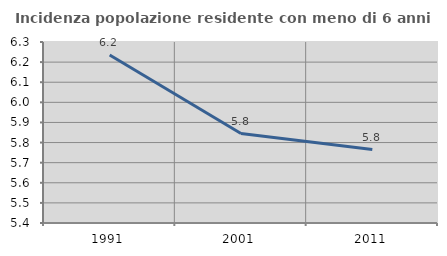
| Category | Incidenza popolazione residente con meno di 6 anni |
|---|---|
| 1991.0 | 6.236 |
| 2001.0 | 5.845 |
| 2011.0 | 5.765 |